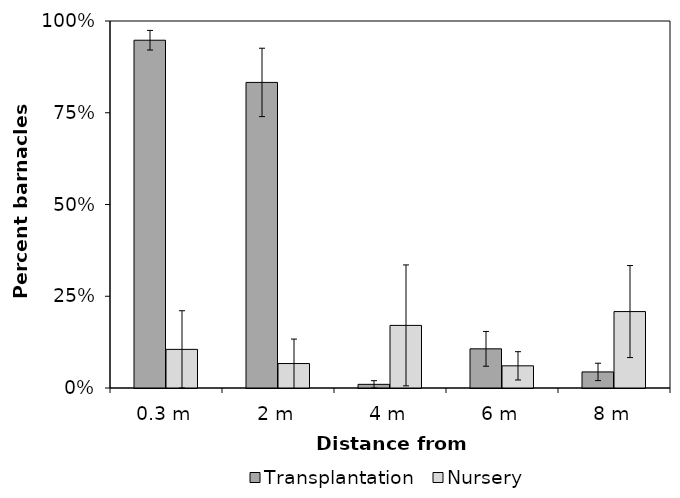
| Category | Transplantation | Nursery |
|---|---|---|
| 0.3 m | 0.948 | 0.105 |
| 2 m | 0.833 | 0.067 |
| 4 m | 0.01 | 0.171 |
| 6 m | 0.107 | 0.06 |
| 8 m | 0.044 | 0.208 |